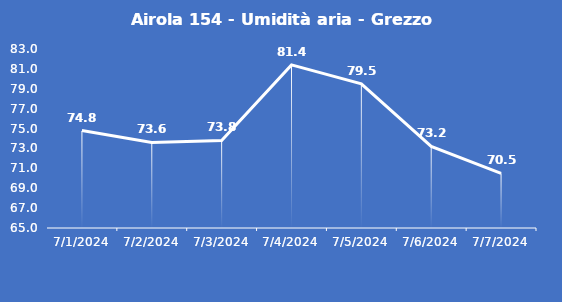
| Category | Airola 154 - Umidità aria - Grezzo (%) |
|---|---|
| 7/1/24 | 74.8 |
| 7/2/24 | 73.6 |
| 7/3/24 | 73.8 |
| 7/4/24 | 81.4 |
| 7/5/24 | 79.5 |
| 7/6/24 | 73.2 |
| 7/7/24 | 70.5 |